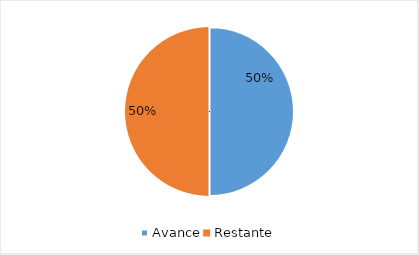
| Category | Series 0 |
|---|---|
| Avance | 0.5 |
| Restante | 0.5 |